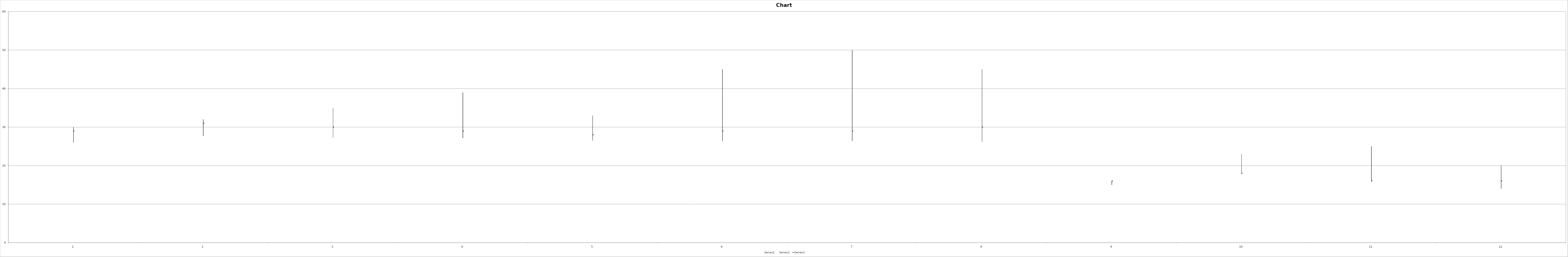
| Category | Series 0 | Series 1 | Series 2 |
|---|---|---|---|
| Jan | 30 | 26 | 29 |
| Feb | 32 | 27.7 | 31 |
| Mar | 35 | 27.29 | 30 |
| Apr | 39 | 27.15 | 29 |
| May | 33 | 26.53 | 28 |
| Jun | 45 | 26.38 | 29 |
| Jul | 50 | 26.4 | 29 |
| Aug | 45 | 26.24 | 30 |
| Sep | 16 | 15 | 16 |
| Oct | 23 | 18 | 18 |
| Nov | 25 | 16 | 16 |
| Dec | 20 | 14 | 16 |